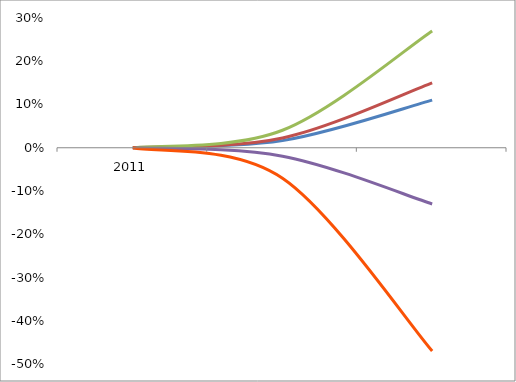
| Category | Series 0 | Series 1 | Series 2 | Series 3 | Series 4 |
|---|---|---|---|---|---|
| 0 | 0 | 0 | 0 | 0 | 0 |
| 1 | 0.017 | 0.022 | 0.04 | -0.02 | -0.07 |
| 2 | 0.11 | 0.15 | 0.27 | -0.13 | -0.47 |